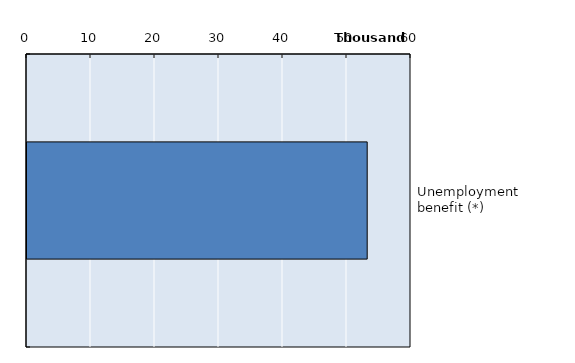
| Category | Series 0 |
|---|---|
| Unemployment benefit (*) | 53156 |